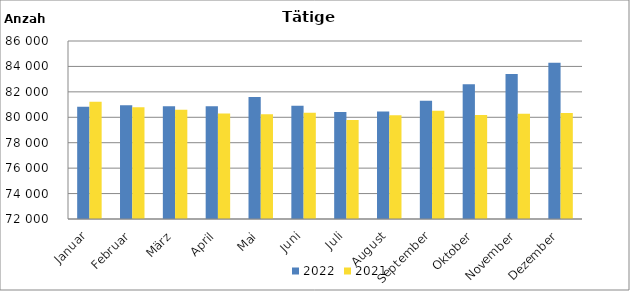
| Category | 2022 | 2021 |
|---|---|---|
| Januar | 80824 | 81217 |
| Februar | 80946 | 80790 |
| März | 80868 | 80588 |
| April | 80864 | 80302 |
| Mai | 81603 | 80242 |
| Juni | 80905 | 80357 |
| Juli | 80416 | 79794 |
| August | 80456 | 80156 |
| September | 81300 | 80506 |
| Oktober | 82595 | 80178 |
| November | 83411 | 80280 |
| Dezember | 84299 | 80328 |